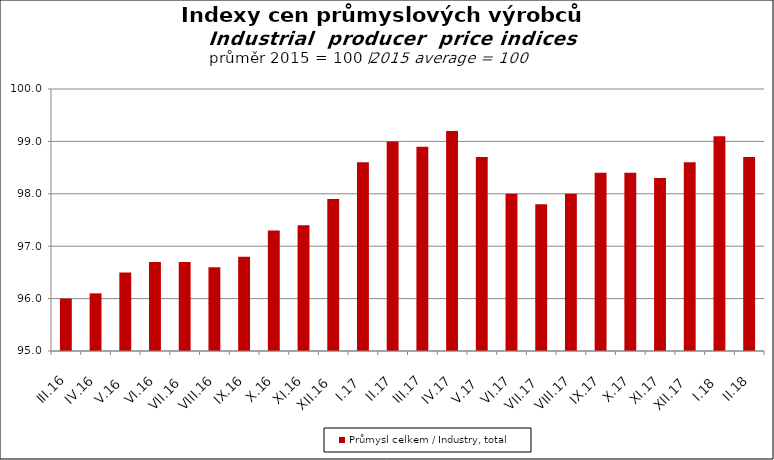
| Category | Průmysl celkem / Industry, total |
|---|---|
| III.16 | 96 |
| IV.16 | 96.1 |
| V.16 | 96.5 |
| VI.16 | 96.7 |
| VII.16 | 96.7 |
| VIII.16 | 96.6 |
| IX.16 | 96.8 |
| X.16 | 97.3 |
| XI.16 | 97.4 |
| XII.16 | 97.9 |
| I.17 | 98.6 |
| II.17 | 99 |
| III.17 | 98.9 |
| IV.17 | 99.2 |
| V.17 | 98.7 |
| VI.17 | 98 |
| VII.17 | 97.8 |
| VIII.17 | 98 |
| IX.17 | 98.4 |
| X.17 | 98.4 |
| XI.17 | 98.3 |
| XII.17 | 98.6 |
| I.18 | 99.1 |
| II.18 | 98.7 |